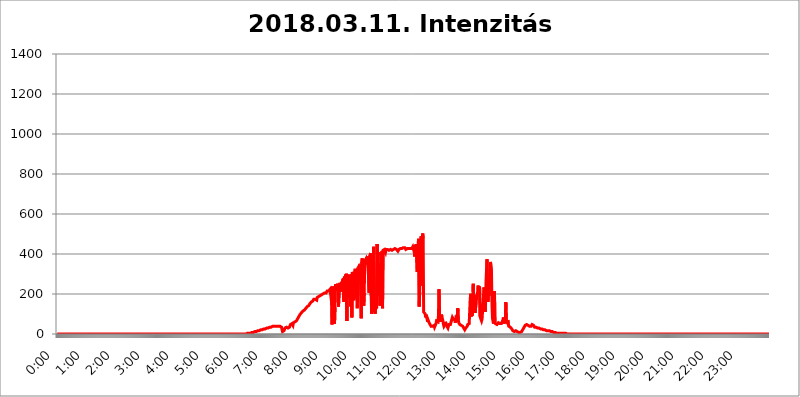
| Category | 2018.03.11. Intenzitás [W/m^2] |
|---|---|
| 0.0 | 0 |
| 0.0006944444444444445 | 0 |
| 0.001388888888888889 | 0 |
| 0.0020833333333333333 | 0 |
| 0.002777777777777778 | 0 |
| 0.003472222222222222 | 0 |
| 0.004166666666666667 | 0 |
| 0.004861111111111111 | 0 |
| 0.005555555555555556 | 0 |
| 0.0062499999999999995 | 0 |
| 0.006944444444444444 | 0 |
| 0.007638888888888889 | 0 |
| 0.008333333333333333 | 0 |
| 0.009027777777777779 | 0 |
| 0.009722222222222222 | 0 |
| 0.010416666666666666 | 0 |
| 0.011111111111111112 | 0 |
| 0.011805555555555555 | 0 |
| 0.012499999999999999 | 0 |
| 0.013194444444444444 | 0 |
| 0.013888888888888888 | 0 |
| 0.014583333333333332 | 0 |
| 0.015277777777777777 | 0 |
| 0.015972222222222224 | 0 |
| 0.016666666666666666 | 0 |
| 0.017361111111111112 | 0 |
| 0.018055555555555557 | 0 |
| 0.01875 | 0 |
| 0.019444444444444445 | 0 |
| 0.02013888888888889 | 0 |
| 0.020833333333333332 | 0 |
| 0.02152777777777778 | 0 |
| 0.022222222222222223 | 0 |
| 0.02291666666666667 | 0 |
| 0.02361111111111111 | 0 |
| 0.024305555555555556 | 0 |
| 0.024999999999999998 | 0 |
| 0.025694444444444447 | 0 |
| 0.02638888888888889 | 0 |
| 0.027083333333333334 | 0 |
| 0.027777777777777776 | 0 |
| 0.02847222222222222 | 0 |
| 0.029166666666666664 | 0 |
| 0.029861111111111113 | 0 |
| 0.030555555555555555 | 0 |
| 0.03125 | 0 |
| 0.03194444444444445 | 0 |
| 0.03263888888888889 | 0 |
| 0.03333333333333333 | 0 |
| 0.034027777777777775 | 0 |
| 0.034722222222222224 | 0 |
| 0.035416666666666666 | 0 |
| 0.036111111111111115 | 0 |
| 0.03680555555555556 | 0 |
| 0.0375 | 0 |
| 0.03819444444444444 | 0 |
| 0.03888888888888889 | 0 |
| 0.03958333333333333 | 0 |
| 0.04027777777777778 | 0 |
| 0.04097222222222222 | 0 |
| 0.041666666666666664 | 0 |
| 0.042361111111111106 | 0 |
| 0.04305555555555556 | 0 |
| 0.043750000000000004 | 0 |
| 0.044444444444444446 | 0 |
| 0.04513888888888889 | 0 |
| 0.04583333333333334 | 0 |
| 0.04652777777777778 | 0 |
| 0.04722222222222222 | 0 |
| 0.04791666666666666 | 0 |
| 0.04861111111111111 | 0 |
| 0.049305555555555554 | 0 |
| 0.049999999999999996 | 0 |
| 0.05069444444444445 | 0 |
| 0.051388888888888894 | 0 |
| 0.052083333333333336 | 0 |
| 0.05277777777777778 | 0 |
| 0.05347222222222222 | 0 |
| 0.05416666666666667 | 0 |
| 0.05486111111111111 | 0 |
| 0.05555555555555555 | 0 |
| 0.05625 | 0 |
| 0.05694444444444444 | 0 |
| 0.057638888888888885 | 0 |
| 0.05833333333333333 | 0 |
| 0.05902777777777778 | 0 |
| 0.059722222222222225 | 0 |
| 0.06041666666666667 | 0 |
| 0.061111111111111116 | 0 |
| 0.06180555555555556 | 0 |
| 0.0625 | 0 |
| 0.06319444444444444 | 0 |
| 0.06388888888888888 | 0 |
| 0.06458333333333334 | 0 |
| 0.06527777777777778 | 0 |
| 0.06597222222222222 | 0 |
| 0.06666666666666667 | 0 |
| 0.06736111111111111 | 0 |
| 0.06805555555555555 | 0 |
| 0.06874999999999999 | 0 |
| 0.06944444444444443 | 0 |
| 0.07013888888888889 | 0 |
| 0.07083333333333333 | 0 |
| 0.07152777777777779 | 0 |
| 0.07222222222222223 | 0 |
| 0.07291666666666667 | 0 |
| 0.07361111111111111 | 0 |
| 0.07430555555555556 | 0 |
| 0.075 | 0 |
| 0.07569444444444444 | 0 |
| 0.0763888888888889 | 0 |
| 0.07708333333333334 | 0 |
| 0.07777777777777778 | 0 |
| 0.07847222222222222 | 0 |
| 0.07916666666666666 | 0 |
| 0.0798611111111111 | 0 |
| 0.08055555555555556 | 0 |
| 0.08125 | 0 |
| 0.08194444444444444 | 0 |
| 0.08263888888888889 | 0 |
| 0.08333333333333333 | 0 |
| 0.08402777777777777 | 0 |
| 0.08472222222222221 | 0 |
| 0.08541666666666665 | 0 |
| 0.08611111111111112 | 0 |
| 0.08680555555555557 | 0 |
| 0.08750000000000001 | 0 |
| 0.08819444444444445 | 0 |
| 0.08888888888888889 | 0 |
| 0.08958333333333333 | 0 |
| 0.09027777777777778 | 0 |
| 0.09097222222222222 | 0 |
| 0.09166666666666667 | 0 |
| 0.09236111111111112 | 0 |
| 0.09305555555555556 | 0 |
| 0.09375 | 0 |
| 0.09444444444444444 | 0 |
| 0.09513888888888888 | 0 |
| 0.09583333333333333 | 0 |
| 0.09652777777777777 | 0 |
| 0.09722222222222222 | 0 |
| 0.09791666666666667 | 0 |
| 0.09861111111111111 | 0 |
| 0.09930555555555555 | 0 |
| 0.09999999999999999 | 0 |
| 0.10069444444444443 | 0 |
| 0.1013888888888889 | 0 |
| 0.10208333333333335 | 0 |
| 0.10277777777777779 | 0 |
| 0.10347222222222223 | 0 |
| 0.10416666666666667 | 0 |
| 0.10486111111111111 | 0 |
| 0.10555555555555556 | 0 |
| 0.10625 | 0 |
| 0.10694444444444444 | 0 |
| 0.1076388888888889 | 0 |
| 0.10833333333333334 | 0 |
| 0.10902777777777778 | 0 |
| 0.10972222222222222 | 0 |
| 0.1111111111111111 | 0 |
| 0.11180555555555556 | 0 |
| 0.11180555555555556 | 0 |
| 0.1125 | 0 |
| 0.11319444444444444 | 0 |
| 0.11388888888888889 | 0 |
| 0.11458333333333333 | 0 |
| 0.11527777777777777 | 0 |
| 0.11597222222222221 | 0 |
| 0.11666666666666665 | 0 |
| 0.1173611111111111 | 0 |
| 0.11805555555555557 | 0 |
| 0.11944444444444445 | 0 |
| 0.12013888888888889 | 0 |
| 0.12083333333333333 | 0 |
| 0.12152777777777778 | 0 |
| 0.12222222222222223 | 0 |
| 0.12291666666666667 | 0 |
| 0.12291666666666667 | 0 |
| 0.12361111111111112 | 0 |
| 0.12430555555555556 | 0 |
| 0.125 | 0 |
| 0.12569444444444444 | 0 |
| 0.12638888888888888 | 0 |
| 0.12708333333333333 | 0 |
| 0.16875 | 0 |
| 0.12847222222222224 | 0 |
| 0.12916666666666668 | 0 |
| 0.12986111111111112 | 0 |
| 0.13055555555555556 | 0 |
| 0.13125 | 0 |
| 0.13194444444444445 | 0 |
| 0.1326388888888889 | 0 |
| 0.13333333333333333 | 0 |
| 0.13402777777777777 | 0 |
| 0.13402777777777777 | 0 |
| 0.13472222222222222 | 0 |
| 0.13541666666666666 | 0 |
| 0.1361111111111111 | 0 |
| 0.13749999999999998 | 0 |
| 0.13819444444444443 | 0 |
| 0.1388888888888889 | 0 |
| 0.13958333333333334 | 0 |
| 0.14027777777777778 | 0 |
| 0.14097222222222222 | 0 |
| 0.14166666666666666 | 0 |
| 0.1423611111111111 | 0 |
| 0.14305555555555557 | 0 |
| 0.14375000000000002 | 0 |
| 0.14444444444444446 | 0 |
| 0.1451388888888889 | 0 |
| 0.1451388888888889 | 0 |
| 0.14652777777777778 | 0 |
| 0.14722222222222223 | 0 |
| 0.14791666666666667 | 0 |
| 0.1486111111111111 | 0 |
| 0.14930555555555555 | 0 |
| 0.15 | 0 |
| 0.15069444444444444 | 0 |
| 0.15138888888888888 | 0 |
| 0.15208333333333332 | 0 |
| 0.15277777777777776 | 0 |
| 0.15347222222222223 | 0 |
| 0.15416666666666667 | 0 |
| 0.15486111111111112 | 0 |
| 0.15555555555555556 | 0 |
| 0.15625 | 0 |
| 0.15694444444444444 | 0 |
| 0.15763888888888888 | 0 |
| 0.15833333333333333 | 0 |
| 0.15902777777777777 | 0 |
| 0.15972222222222224 | 0 |
| 0.16041666666666668 | 0 |
| 0.16111111111111112 | 0 |
| 0.16180555555555556 | 0 |
| 0.1625 | 0 |
| 0.16319444444444445 | 0 |
| 0.1638888888888889 | 0 |
| 0.16458333333333333 | 0 |
| 0.16527777777777777 | 0 |
| 0.16597222222222222 | 0 |
| 0.16666666666666666 | 0 |
| 0.1673611111111111 | 0 |
| 0.16805555555555554 | 0 |
| 0.16874999999999998 | 0 |
| 0.16944444444444443 | 0 |
| 0.17013888888888887 | 0 |
| 0.1708333333333333 | 0 |
| 0.17152777777777775 | 0 |
| 0.17222222222222225 | 0 |
| 0.1729166666666667 | 0 |
| 0.17361111111111113 | 0 |
| 0.17430555555555557 | 0 |
| 0.17500000000000002 | 0 |
| 0.17569444444444446 | 0 |
| 0.1763888888888889 | 0 |
| 0.17708333333333334 | 0 |
| 0.17777777777777778 | 0 |
| 0.17847222222222223 | 0 |
| 0.17916666666666667 | 0 |
| 0.1798611111111111 | 0 |
| 0.18055555555555555 | 0 |
| 0.18125 | 0 |
| 0.18194444444444444 | 0 |
| 0.1826388888888889 | 0 |
| 0.18333333333333335 | 0 |
| 0.1840277777777778 | 0 |
| 0.18472222222222223 | 0 |
| 0.18541666666666667 | 0 |
| 0.18611111111111112 | 0 |
| 0.18680555555555556 | 0 |
| 0.1875 | 0 |
| 0.18819444444444444 | 0 |
| 0.18888888888888888 | 0 |
| 0.18958333333333333 | 0 |
| 0.19027777777777777 | 0 |
| 0.1909722222222222 | 0 |
| 0.19166666666666665 | 0 |
| 0.19236111111111112 | 0 |
| 0.19305555555555554 | 0 |
| 0.19375 | 0 |
| 0.19444444444444445 | 0 |
| 0.1951388888888889 | 0 |
| 0.19583333333333333 | 0 |
| 0.19652777777777777 | 0 |
| 0.19722222222222222 | 0 |
| 0.19791666666666666 | 0 |
| 0.1986111111111111 | 0 |
| 0.19930555555555554 | 0 |
| 0.19999999999999998 | 0 |
| 0.20069444444444443 | 0 |
| 0.20138888888888887 | 0 |
| 0.2020833333333333 | 0 |
| 0.2027777777777778 | 0 |
| 0.2034722222222222 | 0 |
| 0.2041666666666667 | 0 |
| 0.20486111111111113 | 0 |
| 0.20555555555555557 | 0 |
| 0.20625000000000002 | 0 |
| 0.20694444444444446 | 0 |
| 0.2076388888888889 | 0 |
| 0.20833333333333334 | 0 |
| 0.20902777777777778 | 0 |
| 0.20972222222222223 | 0 |
| 0.21041666666666667 | 0 |
| 0.2111111111111111 | 0 |
| 0.21180555555555555 | 0 |
| 0.2125 | 0 |
| 0.21319444444444444 | 0 |
| 0.2138888888888889 | 0 |
| 0.21458333333333335 | 0 |
| 0.2152777777777778 | 0 |
| 0.21597222222222223 | 0 |
| 0.21666666666666667 | 0 |
| 0.21736111111111112 | 0 |
| 0.21805555555555556 | 0 |
| 0.21875 | 0 |
| 0.21944444444444444 | 0 |
| 0.22013888888888888 | 0 |
| 0.22083333333333333 | 0 |
| 0.22152777777777777 | 0 |
| 0.2222222222222222 | 0 |
| 0.22291666666666665 | 0 |
| 0.2236111111111111 | 0 |
| 0.22430555555555556 | 0 |
| 0.225 | 0 |
| 0.22569444444444445 | 0 |
| 0.2263888888888889 | 0 |
| 0.22708333333333333 | 0 |
| 0.22777777777777777 | 0 |
| 0.22847222222222222 | 0 |
| 0.22916666666666666 | 0 |
| 0.2298611111111111 | 0 |
| 0.23055555555555554 | 0 |
| 0.23124999999999998 | 0 |
| 0.23194444444444443 | 0 |
| 0.23263888888888887 | 0 |
| 0.2333333333333333 | 0 |
| 0.2340277777777778 | 0 |
| 0.2347222222222222 | 0 |
| 0.2354166666666667 | 0 |
| 0.23611111111111113 | 0 |
| 0.23680555555555557 | 0 |
| 0.23750000000000002 | 0 |
| 0.23819444444444446 | 0 |
| 0.2388888888888889 | 0 |
| 0.23958333333333334 | 0 |
| 0.24027777777777778 | 0 |
| 0.24097222222222223 | 0 |
| 0.24166666666666667 | 0 |
| 0.2423611111111111 | 0 |
| 0.24305555555555555 | 0 |
| 0.24375 | 0 |
| 0.24444444444444446 | 0 |
| 0.24513888888888888 | 0 |
| 0.24583333333333335 | 0 |
| 0.2465277777777778 | 0 |
| 0.24722222222222223 | 0 |
| 0.24791666666666667 | 0 |
| 0.24861111111111112 | 0 |
| 0.24930555555555556 | 0 |
| 0.25 | 0 |
| 0.25069444444444444 | 0 |
| 0.2513888888888889 | 0 |
| 0.2520833333333333 | 0 |
| 0.25277777777777777 | 0 |
| 0.2534722222222222 | 0 |
| 0.25416666666666665 | 0 |
| 0.2548611111111111 | 0 |
| 0.2555555555555556 | 0 |
| 0.25625000000000003 | 0 |
| 0.2569444444444445 | 0 |
| 0.2576388888888889 | 0 |
| 0.25833333333333336 | 0 |
| 0.2590277777777778 | 0 |
| 0.25972222222222224 | 0 |
| 0.2604166666666667 | 0 |
| 0.2611111111111111 | 0 |
| 0.26180555555555557 | 0 |
| 0.2625 | 0 |
| 0.26319444444444445 | 0 |
| 0.2638888888888889 | 0 |
| 0.26458333333333334 | 0 |
| 0.2652777777777778 | 3.525 |
| 0.2659722222222222 | 3.525 |
| 0.26666666666666666 | 3.525 |
| 0.2673611111111111 | 3.525 |
| 0.26805555555555555 | 3.525 |
| 0.26875 | 3.525 |
| 0.26944444444444443 | 3.525 |
| 0.2701388888888889 | 3.525 |
| 0.2708333333333333 | 3.525 |
| 0.27152777777777776 | 7.887 |
| 0.2722222222222222 | 7.887 |
| 0.27291666666666664 | 7.887 |
| 0.2736111111111111 | 7.887 |
| 0.2743055555555555 | 7.887 |
| 0.27499999999999997 | 7.887 |
| 0.27569444444444446 | 12.257 |
| 0.27638888888888885 | 12.257 |
| 0.27708333333333335 | 12.257 |
| 0.2777777777777778 | 12.257 |
| 0.27847222222222223 | 12.257 |
| 0.2791666666666667 | 12.257 |
| 0.2798611111111111 | 12.257 |
| 0.28055555555555556 | 12.257 |
| 0.28125 | 16.636 |
| 0.28194444444444444 | 16.636 |
| 0.2826388888888889 | 16.636 |
| 0.2833333333333333 | 16.636 |
| 0.28402777777777777 | 16.636 |
| 0.2847222222222222 | 16.636 |
| 0.28541666666666665 | 21.024 |
| 0.28611111111111115 | 21.024 |
| 0.28680555555555554 | 21.024 |
| 0.28750000000000003 | 21.024 |
| 0.2881944444444445 | 21.024 |
| 0.2888888888888889 | 21.024 |
| 0.28958333333333336 | 25.419 |
| 0.2902777777777778 | 25.419 |
| 0.29097222222222224 | 25.419 |
| 0.2916666666666667 | 25.419 |
| 0.2923611111111111 | 29.823 |
| 0.29305555555555557 | 29.823 |
| 0.29375 | 29.823 |
| 0.29444444444444445 | 29.823 |
| 0.2951388888888889 | 29.823 |
| 0.29583333333333334 | 29.823 |
| 0.2965277777777778 | 29.823 |
| 0.2972222222222222 | 34.234 |
| 0.29791666666666666 | 34.234 |
| 0.2986111111111111 | 34.234 |
| 0.29930555555555555 | 34.234 |
| 0.3 | 34.234 |
| 0.30069444444444443 | 34.234 |
| 0.3013888888888889 | 38.653 |
| 0.3020833333333333 | 38.653 |
| 0.30277777777777776 | 38.653 |
| 0.3034722222222222 | 38.653 |
| 0.30416666666666664 | 38.653 |
| 0.3048611111111111 | 38.653 |
| 0.3055555555555555 | 38.653 |
| 0.30624999999999997 | 38.653 |
| 0.3069444444444444 | 38.653 |
| 0.3076388888888889 | 38.653 |
| 0.30833333333333335 | 38.653 |
| 0.3090277777777778 | 38.653 |
| 0.30972222222222223 | 38.653 |
| 0.3104166666666667 | 38.653 |
| 0.3111111111111111 | 43.079 |
| 0.31180555555555556 | 38.653 |
| 0.3125 | 38.653 |
| 0.31319444444444444 | 38.653 |
| 0.3138888888888889 | 38.653 |
| 0.3145833333333333 | 34.234 |
| 0.31527777777777777 | 21.024 |
| 0.3159722222222222 | 12.257 |
| 0.31666666666666665 | 12.257 |
| 0.31736111111111115 | 12.257 |
| 0.31805555555555554 | 16.636 |
| 0.31875000000000003 | 21.024 |
| 0.3194444444444445 | 29.823 |
| 0.3201388888888889 | 34.234 |
| 0.32083333333333336 | 34.234 |
| 0.3215277777777778 | 34.234 |
| 0.32222222222222224 | 34.234 |
| 0.3229166666666667 | 34.234 |
| 0.3236111111111111 | 29.823 |
| 0.32430555555555557 | 29.823 |
| 0.325 | 34.234 |
| 0.32569444444444445 | 34.234 |
| 0.3263888888888889 | 38.653 |
| 0.32708333333333334 | 47.511 |
| 0.3277777777777778 | 47.511 |
| 0.3284722222222222 | 47.511 |
| 0.32916666666666666 | 51.951 |
| 0.3298611111111111 | 51.951 |
| 0.33055555555555555 | 43.079 |
| 0.33125 | 56.398 |
| 0.33194444444444443 | 56.398 |
| 0.3326388888888889 | 60.85 |
| 0.3333333333333333 | 60.85 |
| 0.3340277777777778 | 65.31 |
| 0.3347222222222222 | 65.31 |
| 0.3354166666666667 | 65.31 |
| 0.3361111111111111 | 69.775 |
| 0.3368055555555556 | 69.775 |
| 0.33749999999999997 | 78.722 |
| 0.33819444444444446 | 83.205 |
| 0.33888888888888885 | 87.692 |
| 0.33958333333333335 | 92.184 |
| 0.34027777777777773 | 96.682 |
| 0.34097222222222223 | 101.184 |
| 0.3416666666666666 | 101.184 |
| 0.3423611111111111 | 105.69 |
| 0.3430555555555555 | 105.69 |
| 0.34375 | 110.201 |
| 0.3444444444444445 | 114.716 |
| 0.3451388888888889 | 114.716 |
| 0.3458333333333334 | 119.235 |
| 0.34652777777777777 | 119.235 |
| 0.34722222222222227 | 123.758 |
| 0.34791666666666665 | 123.758 |
| 0.34861111111111115 | 128.284 |
| 0.34930555555555554 | 132.814 |
| 0.35000000000000003 | 132.814 |
| 0.3506944444444444 | 137.347 |
| 0.3513888888888889 | 137.347 |
| 0.3520833333333333 | 141.884 |
| 0.3527777777777778 | 141.884 |
| 0.3534722222222222 | 146.423 |
| 0.3541666666666667 | 150.964 |
| 0.3548611111111111 | 155.509 |
| 0.35555555555555557 | 155.509 |
| 0.35625 | 160.056 |
| 0.35694444444444445 | 160.056 |
| 0.3576388888888889 | 164.605 |
| 0.35833333333333334 | 164.605 |
| 0.3590277777777778 | 169.156 |
| 0.3597222222222222 | 173.709 |
| 0.36041666666666666 | 173.709 |
| 0.3611111111111111 | 173.709 |
| 0.36180555555555555 | 173.709 |
| 0.3625 | 178.264 |
| 0.36319444444444443 | 173.709 |
| 0.3638888888888889 | 169.156 |
| 0.3645833333333333 | 182.82 |
| 0.3652777777777778 | 187.378 |
| 0.3659722222222222 | 187.378 |
| 0.3666666666666667 | 187.378 |
| 0.3673611111111111 | 191.937 |
| 0.3680555555555556 | 187.378 |
| 0.36874999999999997 | 191.937 |
| 0.36944444444444446 | 191.937 |
| 0.37013888888888885 | 196.497 |
| 0.37083333333333335 | 196.497 |
| 0.37152777777777773 | 201.058 |
| 0.37222222222222223 | 201.058 |
| 0.3729166666666666 | 201.058 |
| 0.3736111111111111 | 201.058 |
| 0.3743055555555555 | 205.62 |
| 0.375 | 205.62 |
| 0.3756944444444445 | 205.62 |
| 0.3763888888888889 | 205.62 |
| 0.3770833333333334 | 205.62 |
| 0.37777777777777777 | 210.182 |
| 0.37847222222222227 | 214.746 |
| 0.37916666666666665 | 214.746 |
| 0.37986111111111115 | 214.746 |
| 0.38055555555555554 | 214.746 |
| 0.38125000000000003 | 219.309 |
| 0.3819444444444444 | 219.309 |
| 0.3826388888888889 | 223.873 |
| 0.3833333333333333 | 223.873 |
| 0.3840277777777778 | 228.436 |
| 0.3847222222222222 | 160.056 |
| 0.3854166666666667 | 47.511 |
| 0.3861111111111111 | 237.564 |
| 0.38680555555555557 | 237.564 |
| 0.3875 | 60.85 |
| 0.38819444444444445 | 74.246 |
| 0.3888888888888889 | 51.951 |
| 0.38958333333333334 | 132.814 |
| 0.3902777777777778 | 242.127 |
| 0.3909722222222222 | 237.564 |
| 0.39166666666666666 | 242.127 |
| 0.3923611111111111 | 242.127 |
| 0.39305555555555555 | 246.689 |
| 0.39375 | 251.251 |
| 0.39444444444444443 | 137.347 |
| 0.3951388888888889 | 132.814 |
| 0.3958333333333333 | 246.689 |
| 0.3965277777777778 | 255.813 |
| 0.3972222222222222 | 260.373 |
| 0.3979166666666667 | 210.182 |
| 0.3986111111111111 | 260.373 |
| 0.3993055555555556 | 228.436 |
| 0.39999999999999997 | 269.49 |
| 0.40069444444444446 | 269.49 |
| 0.40138888888888885 | 278.603 |
| 0.40208333333333335 | 160.056 |
| 0.40277777777777773 | 287.709 |
| 0.40347222222222223 | 160.056 |
| 0.4041666666666666 | 296.808 |
| 0.4048611111111111 | 187.378 |
| 0.4055555555555555 | 301.354 |
| 0.40625 | 65.31 |
| 0.4069444444444445 | 242.127 |
| 0.4076388888888889 | 191.937 |
| 0.4083333333333334 | 292.259 |
| 0.40902777777777777 | 182.82 |
| 0.40972222222222227 | 296.808 |
| 0.41041666666666665 | 296.808 |
| 0.41111111111111115 | 301.354 |
| 0.41180555555555554 | 137.347 |
| 0.41250000000000003 | 296.808 |
| 0.4131944444444444 | 83.205 |
| 0.4138888888888889 | 310.44 |
| 0.4145833333333333 | 301.354 |
| 0.4152777777777778 | 310.44 |
| 0.4159722222222222 | 169.156 |
| 0.4166666666666667 | 292.259 |
| 0.4173611111111111 | 319.517 |
| 0.41805555555555557 | 314.98 |
| 0.41875 | 314.98 |
| 0.41944444444444445 | 319.517 |
| 0.4201388888888889 | 324.052 |
| 0.42083333333333334 | 128.284 |
| 0.4215277777777778 | 328.584 |
| 0.4222222222222222 | 333.113 |
| 0.42291666666666666 | 337.639 |
| 0.4236111111111111 | 328.584 |
| 0.42430555555555555 | 269.49 |
| 0.425 | 346.682 |
| 0.42569444444444443 | 351.198 |
| 0.4263888888888889 | 78.722 |
| 0.4270833333333333 | 360.221 |
| 0.4277777777777778 | 378.224 |
| 0.4284722222222222 | 178.264 |
| 0.4291666666666667 | 373.729 |
| 0.4298611111111111 | 141.884 |
| 0.4305555555555556 | 205.62 |
| 0.43124999999999997 | 364.728 |
| 0.43194444444444446 | 364.728 |
| 0.43263888888888885 | 369.23 |
| 0.43333333333333335 | 378.224 |
| 0.43402777777777773 | 369.23 |
| 0.43472222222222223 | 346.682 |
| 0.4354166666666666 | 387.202 |
| 0.4361111111111111 | 382.715 |
| 0.4368055555555555 | 391.685 |
| 0.4375 | 205.62 |
| 0.4381944444444445 | 391.685 |
| 0.4388888888888889 | 396.164 |
| 0.4395833333333334 | 405.108 |
| 0.44027777777777777 | 191.937 |
| 0.44097222222222227 | 101.184 |
| 0.44166666666666665 | 146.423 |
| 0.44236111111111115 | 110.201 |
| 0.44305555555555554 | 178.264 |
| 0.44375000000000003 | 436.27 |
| 0.4444444444444444 | 164.605 |
| 0.4451388888888889 | 119.235 |
| 0.4458333333333333 | 101.184 |
| 0.4465277777777778 | 101.184 |
| 0.4472222222222222 | 146.423 |
| 0.4479166666666667 | 128.284 |
| 0.4486111111111111 | 449.551 |
| 0.44930555555555557 | 360.221 |
| 0.45 | 409.574 |
| 0.45069444444444445 | 191.937 |
| 0.4513888888888889 | 191.937 |
| 0.45208333333333334 | 355.712 |
| 0.4527777777777778 | 141.884 |
| 0.4534722222222222 | 146.423 |
| 0.45416666666666666 | 333.113 |
| 0.4548611111111111 | 405.108 |
| 0.45555555555555555 | 414.035 |
| 0.45625 | 128.284 |
| 0.45694444444444443 | 418.492 |
| 0.4576388888888889 | 418.492 |
| 0.4583333333333333 | 418.492 |
| 0.4590277777777778 | 422.943 |
| 0.4597222222222222 | 422.943 |
| 0.4604166666666667 | 409.574 |
| 0.4611111111111111 | 422.943 |
| 0.4618055555555556 | 422.943 |
| 0.46249999999999997 | 422.943 |
| 0.46319444444444446 | 422.943 |
| 0.46388888888888885 | 418.492 |
| 0.46458333333333335 | 418.492 |
| 0.46527777777777773 | 418.492 |
| 0.46597222222222223 | 418.492 |
| 0.4666666666666666 | 418.492 |
| 0.4673611111111111 | 422.943 |
| 0.4680555555555555 | 418.492 |
| 0.46875 | 418.492 |
| 0.4694444444444445 | 418.492 |
| 0.4701388888888889 | 422.943 |
| 0.4708333333333334 | 422.943 |
| 0.47152777777777777 | 422.943 |
| 0.47222222222222227 | 422.943 |
| 0.47291666666666665 | 427.39 |
| 0.47361111111111115 | 427.39 |
| 0.47430555555555554 | 427.39 |
| 0.47500000000000003 | 422.943 |
| 0.4756944444444444 | 422.943 |
| 0.4763888888888889 | 422.943 |
| 0.4770833333333333 | 418.492 |
| 0.4777777777777778 | 414.035 |
| 0.4784722222222222 | 418.492 |
| 0.4791666666666667 | 422.943 |
| 0.4798611111111111 | 422.943 |
| 0.48055555555555557 | 422.943 |
| 0.48125 | 427.39 |
| 0.48194444444444445 | 427.39 |
| 0.4826388888888889 | 427.39 |
| 0.48333333333333334 | 427.39 |
| 0.4840277777777778 | 427.39 |
| 0.4847222222222222 | 427.39 |
| 0.48541666666666666 | 431.833 |
| 0.4861111111111111 | 431.833 |
| 0.48680555555555555 | 431.833 |
| 0.4875 | 431.833 |
| 0.48819444444444443 | 427.39 |
| 0.4888888888888889 | 422.943 |
| 0.4895833333333333 | 427.39 |
| 0.4902777777777778 | 427.39 |
| 0.4909722222222222 | 427.39 |
| 0.4916666666666667 | 422.943 |
| 0.4923611111111111 | 427.39 |
| 0.4930555555555556 | 427.39 |
| 0.49374999999999997 | 427.39 |
| 0.49444444444444446 | 427.39 |
| 0.49513888888888885 | 427.39 |
| 0.49583333333333335 | 427.39 |
| 0.49652777777777773 | 427.39 |
| 0.49722222222222223 | 427.39 |
| 0.4979166666666666 | 431.833 |
| 0.4986111111111111 | 436.27 |
| 0.4993055555555555 | 440.702 |
| 0.5 | 440.702 |
| 0.5006944444444444 | 409.574 |
| 0.5013888888888889 | 387.202 |
| 0.5020833333333333 | 445.129 |
| 0.5027777777777778 | 431.833 |
| 0.5034722222222222 | 449.551 |
| 0.5041666666666667 | 445.129 |
| 0.5048611111111111 | 310.44 |
| 0.5055555555555555 | 337.639 |
| 0.50625 | 458.38 |
| 0.5069444444444444 | 475.972 |
| 0.5076388888888889 | 137.347 |
| 0.5083333333333333 | 210.182 |
| 0.5090277777777777 | 214.746 |
| 0.5097222222222222 | 462.786 |
| 0.5104166666666666 | 489.108 |
| 0.5111111111111112 | 493.475 |
| 0.5118055555555555 | 242.127 |
| 0.5125000000000001 | 502.192 |
| 0.5131944444444444 | 480.356 |
| 0.513888888888889 | 110.201 |
| 0.5145833333333333 | 110.201 |
| 0.5152777777777778 | 110.201 |
| 0.5159722222222222 | 101.184 |
| 0.5166666666666667 | 83.205 |
| 0.517361111111111 | 96.682 |
| 0.5180555555555556 | 83.205 |
| 0.5187499999999999 | 74.246 |
| 0.5194444444444445 | 60.85 |
| 0.5201388888888888 | 69.775 |
| 0.5208333333333334 | 74.246 |
| 0.5215277777777778 | 56.398 |
| 0.5222222222222223 | 56.398 |
| 0.5229166666666667 | 47.511 |
| 0.5236111111111111 | 43.079 |
| 0.5243055555555556 | 38.653 |
| 0.525 | 38.653 |
| 0.5256944444444445 | 34.234 |
| 0.5263888888888889 | 38.653 |
| 0.5270833333333333 | 38.653 |
| 0.5277777777777778 | 38.653 |
| 0.5284722222222222 | 43.079 |
| 0.5291666666666667 | 34.234 |
| 0.5298611111111111 | 29.823 |
| 0.5305555555555556 | 38.653 |
| 0.53125 | 51.951 |
| 0.5319444444444444 | 65.31 |
| 0.5326388888888889 | 65.31 |
| 0.5333333333333333 | 60.85 |
| 0.5340277777777778 | 60.85 |
| 0.5347222222222222 | 96.682 |
| 0.5354166666666667 | 223.873 |
| 0.5361111111111111 | 105.69 |
| 0.5368055555555555 | 74.246 |
| 0.5375 | 60.85 |
| 0.5381944444444444 | 65.31 |
| 0.5388888888888889 | 96.682 |
| 0.5395833333333333 | 87.692 |
| 0.5402777777777777 | 74.246 |
| 0.5409722222222222 | 65.31 |
| 0.5416666666666666 | 47.511 |
| 0.5423611111111112 | 38.653 |
| 0.5430555555555555 | 38.653 |
| 0.5437500000000001 | 47.511 |
| 0.5444444444444444 | 60.85 |
| 0.545138888888889 | 51.951 |
| 0.5458333333333333 | 43.079 |
| 0.5465277777777778 | 43.079 |
| 0.5472222222222222 | 38.653 |
| 0.5479166666666667 | 29.823 |
| 0.548611111111111 | 34.234 |
| 0.5493055555555556 | 47.511 |
| 0.5499999999999999 | 51.951 |
| 0.5506944444444445 | 51.951 |
| 0.5513888888888888 | 47.511 |
| 0.5520833333333334 | 51.951 |
| 0.5527777777777778 | 65.31 |
| 0.5534722222222223 | 65.31 |
| 0.5541666666666667 | 83.205 |
| 0.5548611111111111 | 83.205 |
| 0.5555555555555556 | 74.246 |
| 0.55625 | 74.246 |
| 0.5569444444444445 | 78.722 |
| 0.5576388888888889 | 69.775 |
| 0.5583333333333333 | 56.398 |
| 0.5590277777777778 | 78.722 |
| 0.5597222222222222 | 92.184 |
| 0.5604166666666667 | 60.85 |
| 0.5611111111111111 | 56.398 |
| 0.5618055555555556 | 128.284 |
| 0.5625 | 69.775 |
| 0.5631944444444444 | 56.398 |
| 0.5638888888888889 | 51.951 |
| 0.5645833333333333 | 47.511 |
| 0.5652777777777778 | 47.511 |
| 0.5659722222222222 | 47.511 |
| 0.5666666666666667 | 43.079 |
| 0.5673611111111111 | 43.079 |
| 0.5680555555555555 | 47.511 |
| 0.56875 | 38.653 |
| 0.5694444444444444 | 34.234 |
| 0.5701388888888889 | 29.823 |
| 0.5708333333333333 | 25.419 |
| 0.5715277777777777 | 21.024 |
| 0.5722222222222222 | 25.419 |
| 0.5729166666666666 | 29.823 |
| 0.5736111111111112 | 29.823 |
| 0.5743055555555555 | 29.823 |
| 0.5750000000000001 | 38.653 |
| 0.5756944444444444 | 47.511 |
| 0.576388888888889 | 47.511 |
| 0.5770833333333333 | 51.951 |
| 0.5777777777777778 | 51.951 |
| 0.5784722222222222 | 56.398 |
| 0.5791666666666667 | 173.709 |
| 0.579861111111111 | 201.058 |
| 0.5805555555555556 | 87.692 |
| 0.5812499999999999 | 123.758 |
| 0.5819444444444445 | 92.184 |
| 0.5826388888888888 | 114.716 |
| 0.5833333333333334 | 251.251 |
| 0.5840277777777778 | 160.056 |
| 0.5847222222222223 | 196.497 |
| 0.5854166666666667 | 128.284 |
| 0.5861111111111111 | 105.69 |
| 0.5868055555555556 | 110.201 |
| 0.5875 | 160.056 |
| 0.5881944444444445 | 178.264 |
| 0.5888888888888889 | 182.82 |
| 0.5895833333333333 | 210.182 |
| 0.5902777777777778 | 242.127 |
| 0.5909722222222222 | 210.182 |
| 0.5916666666666667 | 219.309 |
| 0.5923611111111111 | 237.564 |
| 0.5930555555555556 | 87.692 |
| 0.59375 | 78.722 |
| 0.5944444444444444 | 78.722 |
| 0.5951388888888889 | 65.31 |
| 0.5958333333333333 | 74.246 |
| 0.5965277777777778 | 114.716 |
| 0.5972222222222222 | 119.235 |
| 0.5979166666666667 | 196.497 |
| 0.5986111111111111 | 233 |
| 0.5993055555555555 | 237.564 |
| 0.6 | 110.201 |
| 0.6006944444444444 | 146.423 |
| 0.6013888888888889 | 264.932 |
| 0.6020833333333333 | 324.052 |
| 0.6027777777777777 | 373.729 |
| 0.6034722222222222 | 196.497 |
| 0.6041666666666666 | 160.056 |
| 0.6048611111111112 | 210.182 |
| 0.6055555555555555 | 191.937 |
| 0.6062500000000001 | 255.813 |
| 0.6069444444444444 | 319.517 |
| 0.607638888888889 | 360.221 |
| 0.6083333333333333 | 355.712 |
| 0.6090277777777778 | 310.44 |
| 0.6097222222222222 | 146.423 |
| 0.6104166666666667 | 78.722 |
| 0.611111111111111 | 65.31 |
| 0.6118055555555556 | 51.951 |
| 0.6124999999999999 | 60.85 |
| 0.6131944444444445 | 214.746 |
| 0.6138888888888888 | 60.85 |
| 0.6145833333333334 | 51.951 |
| 0.6152777777777778 | 51.951 |
| 0.6159722222222223 | 51.951 |
| 0.6166666666666667 | 47.511 |
| 0.6173611111111111 | 47.511 |
| 0.6180555555555556 | 51.951 |
| 0.61875 | 56.398 |
| 0.6194444444444445 | 56.398 |
| 0.6201388888888889 | 51.951 |
| 0.6208333333333333 | 51.951 |
| 0.6215277777777778 | 51.951 |
| 0.6222222222222222 | 51.951 |
| 0.6229166666666667 | 51.951 |
| 0.6236111111111111 | 47.511 |
| 0.6243055555555556 | 47.511 |
| 0.625 | 69.775 |
| 0.6256944444444444 | 83.205 |
| 0.6263888888888889 | 51.951 |
| 0.6270833333333333 | 51.951 |
| 0.6277777777777778 | 56.398 |
| 0.6284722222222222 | 69.775 |
| 0.6291666666666667 | 160.056 |
| 0.6298611111111111 | 65.31 |
| 0.6305555555555555 | 60.85 |
| 0.63125 | 56.398 |
| 0.6319444444444444 | 69.775 |
| 0.6326388888888889 | 51.951 |
| 0.6333333333333333 | 38.653 |
| 0.6340277777777777 | 34.234 |
| 0.6347222222222222 | 38.653 |
| 0.6354166666666666 | 34.234 |
| 0.6361111111111112 | 29.823 |
| 0.6368055555555555 | 29.823 |
| 0.6375000000000001 | 25.419 |
| 0.6381944444444444 | 21.024 |
| 0.638888888888889 | 16.636 |
| 0.6395833333333333 | 16.636 |
| 0.6402777777777778 | 12.257 |
| 0.6409722222222222 | 12.257 |
| 0.6416666666666667 | 16.636 |
| 0.642361111111111 | 16.636 |
| 0.6430555555555556 | 16.636 |
| 0.6437499999999999 | 12.257 |
| 0.6444444444444445 | 12.257 |
| 0.6451388888888888 | 12.257 |
| 0.6458333333333334 | 12.257 |
| 0.6465277777777778 | 7.887 |
| 0.6472222222222223 | 7.887 |
| 0.6479166666666667 | 7.887 |
| 0.6486111111111111 | 7.887 |
| 0.6493055555555556 | 7.887 |
| 0.65 | 12.257 |
| 0.6506944444444445 | 12.257 |
| 0.6513888888888889 | 12.257 |
| 0.6520833333333333 | 16.636 |
| 0.6527777777777778 | 21.024 |
| 0.6534722222222222 | 25.419 |
| 0.6541666666666667 | 29.823 |
| 0.6548611111111111 | 29.823 |
| 0.6555555555555556 | 34.234 |
| 0.65625 | 43.079 |
| 0.6569444444444444 | 47.511 |
| 0.6576388888888889 | 47.511 |
| 0.6583333333333333 | 47.511 |
| 0.6590277777777778 | 43.079 |
| 0.6597222222222222 | 43.079 |
| 0.6604166666666667 | 43.079 |
| 0.6611111111111111 | 43.079 |
| 0.6618055555555555 | 38.653 |
| 0.6625 | 38.653 |
| 0.6631944444444444 | 38.653 |
| 0.6638888888888889 | 38.653 |
| 0.6645833333333333 | 38.653 |
| 0.6652777777777777 | 38.653 |
| 0.6659722222222222 | 47.511 |
| 0.6666666666666666 | 47.511 |
| 0.6673611111111111 | 47.511 |
| 0.6680555555555556 | 43.079 |
| 0.6687500000000001 | 38.653 |
| 0.6694444444444444 | 34.234 |
| 0.6701388888888888 | 34.234 |
| 0.6708333333333334 | 34.234 |
| 0.6715277777777778 | 34.234 |
| 0.6722222222222222 | 29.823 |
| 0.6729166666666666 | 29.823 |
| 0.6736111111111112 | 29.823 |
| 0.6743055555555556 | 29.823 |
| 0.6749999999999999 | 29.823 |
| 0.6756944444444444 | 29.823 |
| 0.6763888888888889 | 29.823 |
| 0.6770833333333334 | 25.419 |
| 0.6777777777777777 | 25.419 |
| 0.6784722222222223 | 25.419 |
| 0.6791666666666667 | 25.419 |
| 0.6798611111111111 | 25.419 |
| 0.6805555555555555 | 21.024 |
| 0.68125 | 21.024 |
| 0.6819444444444445 | 21.024 |
| 0.6826388888888889 | 21.024 |
| 0.6833333333333332 | 21.024 |
| 0.6840277777777778 | 21.024 |
| 0.6847222222222222 | 21.024 |
| 0.6854166666666667 | 21.024 |
| 0.686111111111111 | 16.636 |
| 0.6868055555555556 | 16.636 |
| 0.6875 | 16.636 |
| 0.6881944444444444 | 16.636 |
| 0.688888888888889 | 16.636 |
| 0.6895833333333333 | 16.636 |
| 0.6902777777777778 | 16.636 |
| 0.6909722222222222 | 16.636 |
| 0.6916666666666668 | 12.257 |
| 0.6923611111111111 | 12.257 |
| 0.6930555555555555 | 12.257 |
| 0.69375 | 12.257 |
| 0.6944444444444445 | 12.257 |
| 0.6951388888888889 | 12.257 |
| 0.6958333333333333 | 7.887 |
| 0.6965277777777777 | 7.887 |
| 0.6972222222222223 | 7.887 |
| 0.6979166666666666 | 7.887 |
| 0.6986111111111111 | 7.887 |
| 0.6993055555555556 | 3.525 |
| 0.7000000000000001 | 3.525 |
| 0.7006944444444444 | 3.525 |
| 0.7013888888888888 | 3.525 |
| 0.7020833333333334 | 3.525 |
| 0.7027777777777778 | 3.525 |
| 0.7034722222222222 | 3.525 |
| 0.7041666666666666 | 3.525 |
| 0.7048611111111112 | 3.525 |
| 0.7055555555555556 | 3.525 |
| 0.7062499999999999 | 3.525 |
| 0.7069444444444444 | 3.525 |
| 0.7076388888888889 | 3.525 |
| 0.7083333333333334 | 3.525 |
| 0.7090277777777777 | 3.525 |
| 0.7097222222222223 | 3.525 |
| 0.7104166666666667 | 3.525 |
| 0.7111111111111111 | 3.525 |
| 0.7118055555555555 | 3.525 |
| 0.7125 | 3.525 |
| 0.7131944444444445 | 3.525 |
| 0.7138888888888889 | 3.525 |
| 0.7145833333333332 | 3.525 |
| 0.7152777777777778 | 0 |
| 0.7159722222222222 | 0 |
| 0.7166666666666667 | 0 |
| 0.717361111111111 | 0 |
| 0.7180555555555556 | 0 |
| 0.71875 | 0 |
| 0.7194444444444444 | 0 |
| 0.720138888888889 | 0 |
| 0.7208333333333333 | 0 |
| 0.7215277777777778 | 0 |
| 0.7222222222222222 | 0 |
| 0.7229166666666668 | 0 |
| 0.7236111111111111 | 0 |
| 0.7243055555555555 | 0 |
| 0.725 | 0 |
| 0.7256944444444445 | 0 |
| 0.7263888888888889 | 0 |
| 0.7270833333333333 | 0 |
| 0.7277777777777777 | 0 |
| 0.7284722222222223 | 0 |
| 0.7291666666666666 | 0 |
| 0.7298611111111111 | 0 |
| 0.7305555555555556 | 0 |
| 0.7312500000000001 | 0 |
| 0.7319444444444444 | 0 |
| 0.7326388888888888 | 0 |
| 0.7333333333333334 | 0 |
| 0.7340277777777778 | 0 |
| 0.7347222222222222 | 0 |
| 0.7354166666666666 | 0 |
| 0.7361111111111112 | 0 |
| 0.7368055555555556 | 0 |
| 0.7374999999999999 | 0 |
| 0.7381944444444444 | 0 |
| 0.7388888888888889 | 0 |
| 0.7395833333333334 | 0 |
| 0.7402777777777777 | 0 |
| 0.7409722222222223 | 0 |
| 0.7416666666666667 | 0 |
| 0.7423611111111111 | 0 |
| 0.7430555555555555 | 0 |
| 0.74375 | 0 |
| 0.7444444444444445 | 0 |
| 0.7451388888888889 | 0 |
| 0.7458333333333332 | 0 |
| 0.7465277777777778 | 0 |
| 0.7472222222222222 | 0 |
| 0.7479166666666667 | 0 |
| 0.748611111111111 | 0 |
| 0.7493055555555556 | 0 |
| 0.75 | 0 |
| 0.7506944444444444 | 0 |
| 0.751388888888889 | 0 |
| 0.7520833333333333 | 0 |
| 0.7527777777777778 | 0 |
| 0.7534722222222222 | 0 |
| 0.7541666666666668 | 0 |
| 0.7548611111111111 | 0 |
| 0.7555555555555555 | 0 |
| 0.75625 | 0 |
| 0.7569444444444445 | 0 |
| 0.7576388888888889 | 0 |
| 0.7583333333333333 | 0 |
| 0.7590277777777777 | 0 |
| 0.7597222222222223 | 0 |
| 0.7604166666666666 | 0 |
| 0.7611111111111111 | 0 |
| 0.7618055555555556 | 0 |
| 0.7625000000000001 | 0 |
| 0.7631944444444444 | 0 |
| 0.7638888888888888 | 0 |
| 0.7645833333333334 | 0 |
| 0.7652777777777778 | 0 |
| 0.7659722222222222 | 0 |
| 0.7666666666666666 | 0 |
| 0.7673611111111112 | 0 |
| 0.7680555555555556 | 0 |
| 0.7687499999999999 | 0 |
| 0.7694444444444444 | 0 |
| 0.7701388888888889 | 0 |
| 0.7708333333333334 | 0 |
| 0.7715277777777777 | 0 |
| 0.7722222222222223 | 0 |
| 0.7729166666666667 | 0 |
| 0.7736111111111111 | 0 |
| 0.7743055555555555 | 0 |
| 0.775 | 0 |
| 0.7756944444444445 | 0 |
| 0.7763888888888889 | 0 |
| 0.7770833333333332 | 0 |
| 0.7777777777777778 | 0 |
| 0.7784722222222222 | 0 |
| 0.7791666666666667 | 0 |
| 0.779861111111111 | 0 |
| 0.7805555555555556 | 0 |
| 0.78125 | 0 |
| 0.7819444444444444 | 0 |
| 0.782638888888889 | 0 |
| 0.7833333333333333 | 0 |
| 0.7840277777777778 | 0 |
| 0.7847222222222222 | 0 |
| 0.7854166666666668 | 0 |
| 0.7861111111111111 | 0 |
| 0.7868055555555555 | 0 |
| 0.7875 | 0 |
| 0.7881944444444445 | 0 |
| 0.7888888888888889 | 0 |
| 0.7895833333333333 | 0 |
| 0.7902777777777777 | 0 |
| 0.7909722222222223 | 0 |
| 0.7916666666666666 | 0 |
| 0.7923611111111111 | 0 |
| 0.7930555555555556 | 0 |
| 0.7937500000000001 | 0 |
| 0.7944444444444444 | 0 |
| 0.7951388888888888 | 0 |
| 0.7958333333333334 | 0 |
| 0.7965277777777778 | 0 |
| 0.7972222222222222 | 0 |
| 0.7979166666666666 | 0 |
| 0.7986111111111112 | 0 |
| 0.7993055555555556 | 0 |
| 0.7999999999999999 | 0 |
| 0.8006944444444444 | 0 |
| 0.8013888888888889 | 0 |
| 0.8020833333333334 | 0 |
| 0.8027777777777777 | 0 |
| 0.8034722222222223 | 0 |
| 0.8041666666666667 | 0 |
| 0.8048611111111111 | 0 |
| 0.8055555555555555 | 0 |
| 0.80625 | 0 |
| 0.8069444444444445 | 0 |
| 0.8076388888888889 | 0 |
| 0.8083333333333332 | 0 |
| 0.8090277777777778 | 0 |
| 0.8097222222222222 | 0 |
| 0.8104166666666667 | 0 |
| 0.811111111111111 | 0 |
| 0.8118055555555556 | 0 |
| 0.8125 | 0 |
| 0.8131944444444444 | 0 |
| 0.813888888888889 | 0 |
| 0.8145833333333333 | 0 |
| 0.8152777777777778 | 0 |
| 0.8159722222222222 | 0 |
| 0.8166666666666668 | 0 |
| 0.8173611111111111 | 0 |
| 0.8180555555555555 | 0 |
| 0.81875 | 0 |
| 0.8194444444444445 | 0 |
| 0.8201388888888889 | 0 |
| 0.8208333333333333 | 0 |
| 0.8215277777777777 | 0 |
| 0.8222222222222223 | 0 |
| 0.8229166666666666 | 0 |
| 0.8236111111111111 | 0 |
| 0.8243055555555556 | 0 |
| 0.8250000000000001 | 0 |
| 0.8256944444444444 | 0 |
| 0.8263888888888888 | 0 |
| 0.8270833333333334 | 0 |
| 0.8277777777777778 | 0 |
| 0.8284722222222222 | 0 |
| 0.8291666666666666 | 0 |
| 0.8298611111111112 | 0 |
| 0.8305555555555556 | 0 |
| 0.8312499999999999 | 0 |
| 0.8319444444444444 | 0 |
| 0.8326388888888889 | 0 |
| 0.8333333333333334 | 0 |
| 0.8340277777777777 | 0 |
| 0.8347222222222223 | 0 |
| 0.8354166666666667 | 0 |
| 0.8361111111111111 | 0 |
| 0.8368055555555555 | 0 |
| 0.8375 | 0 |
| 0.8381944444444445 | 0 |
| 0.8388888888888889 | 0 |
| 0.8395833333333332 | 0 |
| 0.8402777777777778 | 0 |
| 0.8409722222222222 | 0 |
| 0.8416666666666667 | 0 |
| 0.842361111111111 | 0 |
| 0.8430555555555556 | 0 |
| 0.84375 | 0 |
| 0.8444444444444444 | 0 |
| 0.845138888888889 | 0 |
| 0.8458333333333333 | 0 |
| 0.8465277777777778 | 0 |
| 0.8472222222222222 | 0 |
| 0.8479166666666668 | 0 |
| 0.8486111111111111 | 0 |
| 0.8493055555555555 | 0 |
| 0.85 | 0 |
| 0.8506944444444445 | 0 |
| 0.8513888888888889 | 0 |
| 0.8520833333333333 | 0 |
| 0.8527777777777777 | 0 |
| 0.8534722222222223 | 0 |
| 0.8541666666666666 | 0 |
| 0.8548611111111111 | 0 |
| 0.8555555555555556 | 0 |
| 0.8562500000000001 | 0 |
| 0.8569444444444444 | 0 |
| 0.8576388888888888 | 0 |
| 0.8583333333333334 | 0 |
| 0.8590277777777778 | 0 |
| 0.8597222222222222 | 0 |
| 0.8604166666666666 | 0 |
| 0.8611111111111112 | 0 |
| 0.8618055555555556 | 0 |
| 0.8624999999999999 | 0 |
| 0.8631944444444444 | 0 |
| 0.8638888888888889 | 0 |
| 0.8645833333333334 | 0 |
| 0.8652777777777777 | 0 |
| 0.8659722222222223 | 0 |
| 0.8666666666666667 | 0 |
| 0.8673611111111111 | 0 |
| 0.8680555555555555 | 0 |
| 0.86875 | 0 |
| 0.8694444444444445 | 0 |
| 0.8701388888888889 | 0 |
| 0.8708333333333332 | 0 |
| 0.8715277777777778 | 0 |
| 0.8722222222222222 | 0 |
| 0.8729166666666667 | 0 |
| 0.873611111111111 | 0 |
| 0.8743055555555556 | 0 |
| 0.875 | 0 |
| 0.8756944444444444 | 0 |
| 0.876388888888889 | 0 |
| 0.8770833333333333 | 0 |
| 0.8777777777777778 | 0 |
| 0.8784722222222222 | 0 |
| 0.8791666666666668 | 0 |
| 0.8798611111111111 | 0 |
| 0.8805555555555555 | 0 |
| 0.88125 | 0 |
| 0.8819444444444445 | 0 |
| 0.8826388888888889 | 0 |
| 0.8833333333333333 | 0 |
| 0.8840277777777777 | 0 |
| 0.8847222222222223 | 0 |
| 0.8854166666666666 | 0 |
| 0.8861111111111111 | 0 |
| 0.8868055555555556 | 0 |
| 0.8875000000000001 | 0 |
| 0.8881944444444444 | 0 |
| 0.8888888888888888 | 0 |
| 0.8895833333333334 | 0 |
| 0.8902777777777778 | 0 |
| 0.8909722222222222 | 0 |
| 0.8916666666666666 | 0 |
| 0.8923611111111112 | 0 |
| 0.8930555555555556 | 0 |
| 0.8937499999999999 | 0 |
| 0.8944444444444444 | 0 |
| 0.8951388888888889 | 0 |
| 0.8958333333333334 | 0 |
| 0.8965277777777777 | 0 |
| 0.8972222222222223 | 0 |
| 0.8979166666666667 | 0 |
| 0.8986111111111111 | 0 |
| 0.8993055555555555 | 0 |
| 0.9 | 0 |
| 0.9006944444444445 | 0 |
| 0.9013888888888889 | 0 |
| 0.9020833333333332 | 0 |
| 0.9027777777777778 | 0 |
| 0.9034722222222222 | 0 |
| 0.9041666666666667 | 0 |
| 0.904861111111111 | 0 |
| 0.9055555555555556 | 0 |
| 0.90625 | 0 |
| 0.9069444444444444 | 0 |
| 0.907638888888889 | 0 |
| 0.9083333333333333 | 0 |
| 0.9090277777777778 | 0 |
| 0.9097222222222222 | 0 |
| 0.9104166666666668 | 0 |
| 0.9111111111111111 | 0 |
| 0.9118055555555555 | 0 |
| 0.9125 | 0 |
| 0.9131944444444445 | 0 |
| 0.9138888888888889 | 0 |
| 0.9145833333333333 | 0 |
| 0.9152777777777777 | 0 |
| 0.9159722222222223 | 0 |
| 0.9166666666666666 | 0 |
| 0.9173611111111111 | 0 |
| 0.9180555555555556 | 0 |
| 0.9187500000000001 | 0 |
| 0.9194444444444444 | 0 |
| 0.9201388888888888 | 0 |
| 0.9208333333333334 | 0 |
| 0.9215277777777778 | 0 |
| 0.9222222222222222 | 0 |
| 0.9229166666666666 | 0 |
| 0.9236111111111112 | 0 |
| 0.9243055555555556 | 0 |
| 0.9249999999999999 | 0 |
| 0.9256944444444444 | 0 |
| 0.9263888888888889 | 0 |
| 0.9270833333333334 | 0 |
| 0.9277777777777777 | 0 |
| 0.9284722222222223 | 0 |
| 0.9291666666666667 | 0 |
| 0.9298611111111111 | 0 |
| 0.9305555555555555 | 0 |
| 0.93125 | 0 |
| 0.9319444444444445 | 0 |
| 0.9326388888888889 | 0 |
| 0.9333333333333332 | 0 |
| 0.9340277777777778 | 0 |
| 0.9347222222222222 | 0 |
| 0.9354166666666667 | 0 |
| 0.936111111111111 | 0 |
| 0.9368055555555556 | 0 |
| 0.9375 | 0 |
| 0.9381944444444444 | 0 |
| 0.938888888888889 | 0 |
| 0.9395833333333333 | 0 |
| 0.9402777777777778 | 0 |
| 0.9409722222222222 | 0 |
| 0.9416666666666668 | 0 |
| 0.9423611111111111 | 0 |
| 0.9430555555555555 | 0 |
| 0.94375 | 0 |
| 0.9444444444444445 | 0 |
| 0.9451388888888889 | 0 |
| 0.9458333333333333 | 0 |
| 0.9465277777777777 | 0 |
| 0.9472222222222223 | 0 |
| 0.9479166666666666 | 0 |
| 0.9486111111111111 | 0 |
| 0.9493055555555556 | 0 |
| 0.9500000000000001 | 0 |
| 0.9506944444444444 | 0 |
| 0.9513888888888888 | 0 |
| 0.9520833333333334 | 0 |
| 0.9527777777777778 | 0 |
| 0.9534722222222222 | 0 |
| 0.9541666666666666 | 0 |
| 0.9548611111111112 | 0 |
| 0.9555555555555556 | 0 |
| 0.9562499999999999 | 0 |
| 0.9569444444444444 | 0 |
| 0.9576388888888889 | 0 |
| 0.9583333333333334 | 0 |
| 0.9590277777777777 | 0 |
| 0.9597222222222223 | 0 |
| 0.9604166666666667 | 0 |
| 0.9611111111111111 | 0 |
| 0.9618055555555555 | 0 |
| 0.9625 | 0 |
| 0.9631944444444445 | 0 |
| 0.9638888888888889 | 0 |
| 0.9645833333333332 | 0 |
| 0.9652777777777778 | 0 |
| 0.9659722222222222 | 0 |
| 0.9666666666666667 | 0 |
| 0.967361111111111 | 0 |
| 0.9680555555555556 | 0 |
| 0.96875 | 0 |
| 0.9694444444444444 | 0 |
| 0.970138888888889 | 0 |
| 0.9708333333333333 | 0 |
| 0.9715277777777778 | 0 |
| 0.9722222222222222 | 0 |
| 0.9729166666666668 | 0 |
| 0.9736111111111111 | 0 |
| 0.9743055555555555 | 0 |
| 0.975 | 0 |
| 0.9756944444444445 | 0 |
| 0.9763888888888889 | 0 |
| 0.9770833333333333 | 0 |
| 0.9777777777777777 | 0 |
| 0.9784722222222223 | 0 |
| 0.9791666666666666 | 0 |
| 0.9798611111111111 | 0 |
| 0.9805555555555556 | 0 |
| 0.9812500000000001 | 0 |
| 0.9819444444444444 | 0 |
| 0.9826388888888888 | 0 |
| 0.9833333333333334 | 0 |
| 0.9840277777777778 | 0 |
| 0.9847222222222222 | 0 |
| 0.9854166666666666 | 0 |
| 0.9861111111111112 | 0 |
| 0.9868055555555556 | 0 |
| 0.9874999999999999 | 0 |
| 0.9881944444444444 | 0 |
| 0.9888888888888889 | 0 |
| 0.9895833333333334 | 0 |
| 0.9902777777777777 | 0 |
| 0.9909722222222223 | 0 |
| 0.9916666666666667 | 0 |
| 0.9923611111111111 | 0 |
| 0.9930555555555555 | 0 |
| 0.99375 | 0 |
| 0.9944444444444445 | 0 |
| 0.9951388888888889 | 0 |
| 0.9958333333333332 | 0 |
| 0.9965277777777778 | 0 |
| 0.9972222222222222 | 0 |
| 0.9979166666666667 | 0 |
| 0.998611111111111 | 0 |
| 0.9993055555555556 | 0 |